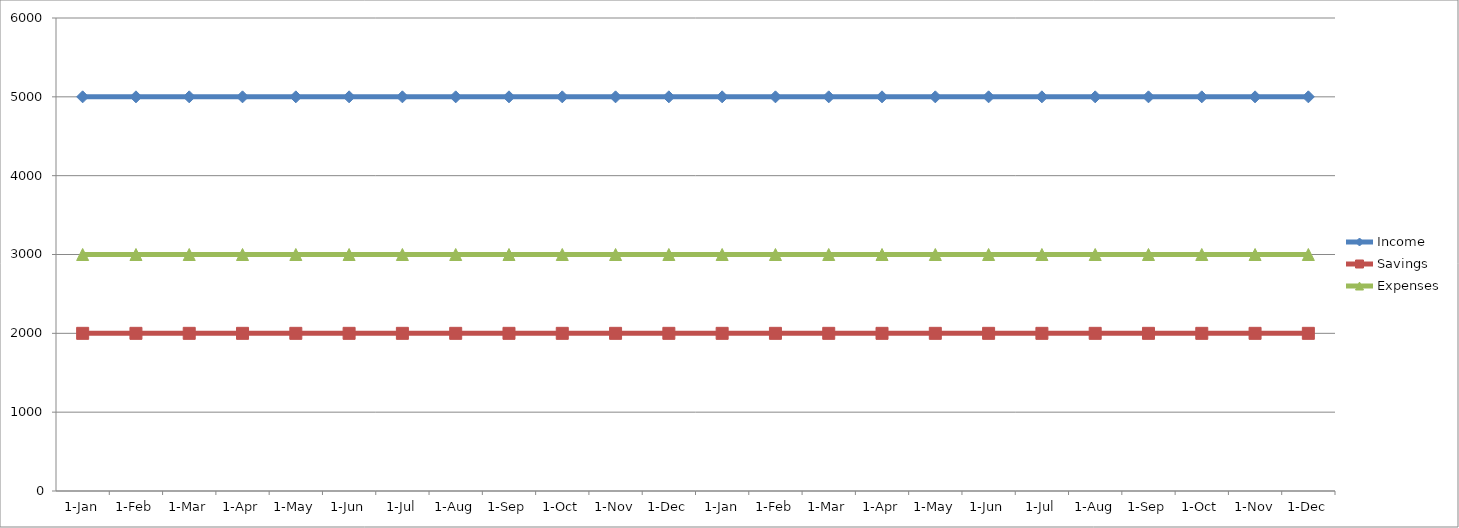
| Category | Income | Savings | Expenses |
|---|---|---|---|
| 2018-01-01 | 5000 | 2000 | 3000 |
| 2018-02-01 | 5000 | 2000 | 3000 |
| 2018-03-01 | 5000 | 2000 | 3000 |
| 2018-04-01 | 5000 | 2000 | 3000 |
| 2018-05-01 | 5000 | 2000 | 3000 |
| 2018-06-01 | 5000 | 2000 | 3000 |
| 2018-07-01 | 5000 | 2000 | 3000 |
| 2018-08-01 | 5000 | 2000 | 3000 |
| 2018-09-01 | 5000 | 2000 | 3000 |
| 2018-10-01 | 5000 | 2000 | 3000 |
| 2018-11-01 | 5000 | 2000 | 3000 |
| 2018-12-01 | 5000 | 2000 | 3000 |
| 2019-01-01 | 5000 | 2000 | 3000 |
| 2019-02-01 | 5000 | 2000 | 3000 |
| 2019-03-01 | 5000 | 2000 | 3000 |
| 2019-04-01 | 5000 | 2000 | 3000 |
| 2019-05-01 | 5000 | 2000 | 3000 |
| 2019-06-01 | 5000 | 2000 | 3000 |
| 2019-07-01 | 5000 | 2000 | 3000 |
| 2019-08-01 | 5000 | 2000 | 3000 |
| 2019-09-01 | 5000 | 2000 | 3000 |
| 2019-10-01 | 5000 | 2000 | 3000 |
| 2019-11-01 | 5000 | 2000 | 3000 |
| 2019-12-01 | 5000 | 2000 | 3000 |